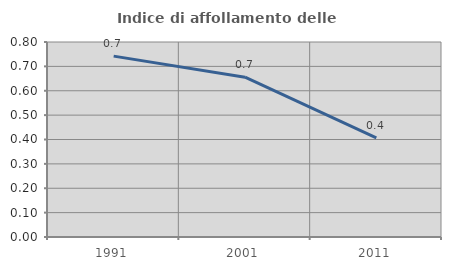
| Category | Indice di affollamento delle abitazioni  |
|---|---|
| 1991.0 | 0.742 |
| 2001.0 | 0.656 |
| 2011.0 | 0.407 |